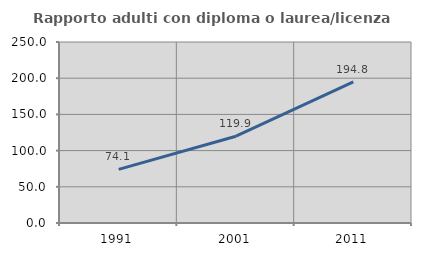
| Category | Rapporto adulti con diploma o laurea/licenza media  |
|---|---|
| 1991.0 | 74.128 |
| 2001.0 | 119.865 |
| 2011.0 | 194.79 |